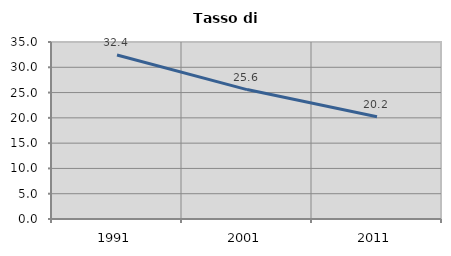
| Category | Tasso di disoccupazione   |
|---|---|
| 1991.0 | 32.434 |
| 2001.0 | 25.589 |
| 2011.0 | 20.236 |